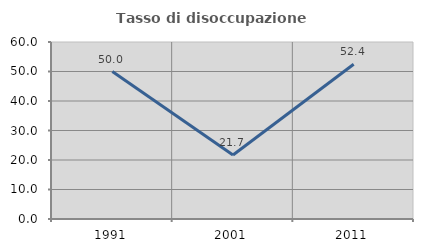
| Category | Tasso di disoccupazione giovanile  |
|---|---|
| 1991.0 | 50 |
| 2001.0 | 21.711 |
| 2011.0 | 52.439 |